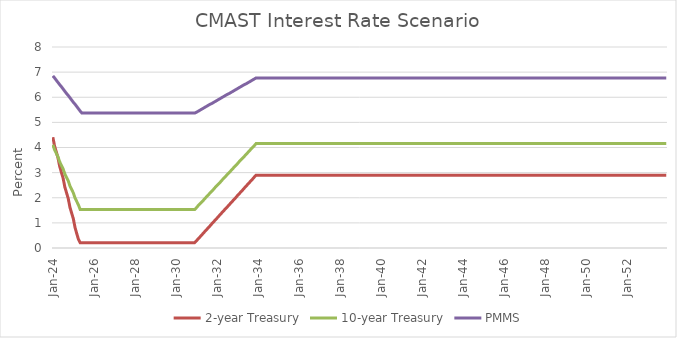
| Category | 2-year Treasury | 10-year Treasury | PMMS |
|---|---|---|---|
| 2024-01-31 | 4.41 | 4.11 | 6.85 |
| 2024-02-29 | 4.06 | 3.91 | 6.77 |
| 2024-03-29 | 3.83 | 3.77 | 6.68 |
| 2024-04-29 | 3.59 | 3.63 | 6.59 |
| 2024-05-29 | 3.25 | 3.43 | 6.5 |
| 2024-06-29 | 3.01 | 3.29 | 6.42 |
| 2024-07-29 | 2.78 | 3.15 | 6.33 |
| 2024-08-29 | 2.43 | 2.95 | 6.24 |
| 2024-09-29 | 2.2 | 2.81 | 6.15 |
| 2024-10-29 | 1.97 | 2.67 | 6.07 |
| 2024-11-29 | 1.62 | 2.47 | 5.98 |
| 2024-12-29 | 1.39 | 2.33 | 5.89 |
| 2025-01-29 | 1.16 | 2.19 | 5.8 |
| 2025-02-28 | 0.81 | 1.99 | 5.72 |
| 2025-03-28 | 0.57 | 1.85 | 5.63 |
| 2025-04-28 | 0.34 | 1.71 | 5.54 |
| 2025-05-28 | 0.21 | 1.53 | 5.45 |
| 2025-06-28 | 0.21 | 1.53 | 5.37 |
| 2025-07-28 | 0.21 | 1.53 | 5.37 |
| 2025-08-28 | 0.21 | 1.53 | 5.37 |
| 2025-09-28 | 0.21 | 1.53 | 5.37 |
| 2025-10-28 | 0.21 | 1.53 | 5.37 |
| 2025-11-28 | 0.21 | 1.53 | 5.37 |
| 2025-12-28 | 0.21 | 1.53 | 5.37 |
| 2026-01-28 | 0.21 | 1.53 | 5.37 |
| 2026-02-28 | 0.21 | 1.53 | 5.37 |
| 2026-03-28 | 0.21 | 1.53 | 5.37 |
| 2026-04-28 | 0.21 | 1.53 | 5.37 |
| 2026-05-28 | 0.21 | 1.53 | 5.37 |
| 2026-06-28 | 0.21 | 1.53 | 5.37 |
| 2026-07-28 | 0.21 | 1.53 | 5.37 |
| 2026-08-28 | 0.21 | 1.53 | 5.37 |
| 2026-09-28 | 0.21 | 1.53 | 5.37 |
| 2026-10-28 | 0.21 | 1.53 | 5.37 |
| 2026-11-28 | 0.21 | 1.53 | 5.37 |
| 2026-12-28 | 0.21 | 1.53 | 5.37 |
| 2027-01-28 | 0.21 | 1.53 | 5.37 |
| 2027-02-28 | 0.21 | 1.53 | 5.37 |
| 2027-03-28 | 0.21 | 1.53 | 5.37 |
| 2027-04-28 | 0.21 | 1.53 | 5.37 |
| 2027-05-28 | 0.21 | 1.53 | 5.37 |
| 2027-06-28 | 0.21 | 1.53 | 5.37 |
| 2027-07-28 | 0.21 | 1.53 | 5.37 |
| 2027-08-28 | 0.21 | 1.53 | 5.37 |
| 2027-09-28 | 0.21 | 1.53 | 5.37 |
| 2027-10-28 | 0.21 | 1.53 | 5.37 |
| 2027-11-28 | 0.21 | 1.53 | 5.37 |
| 2027-12-28 | 0.21 | 1.53 | 5.37 |
| 2028-01-28 | 0.21 | 1.53 | 5.37 |
| 2028-02-28 | 0.21 | 1.53 | 5.37 |
| 2028-03-28 | 0.21 | 1.53 | 5.37 |
| 2028-04-28 | 0.21 | 1.53 | 5.37 |
| 2028-05-28 | 0.21 | 1.53 | 5.37 |
| 2028-06-28 | 0.21 | 1.53 | 5.37 |
| 2028-07-28 | 0.21 | 1.53 | 5.37 |
| 2028-08-28 | 0.21 | 1.53 | 5.37 |
| 2028-09-28 | 0.21 | 1.53 | 5.37 |
| 2028-10-28 | 0.21 | 1.53 | 5.37 |
| 2028-11-28 | 0.21 | 1.53 | 5.37 |
| 2028-12-28 | 0.21 | 1.53 | 5.37 |
| 2029-01-28 | 0.21 | 1.53 | 5.37 |
| 2029-02-28 | 0.21 | 1.53 | 5.37 |
| 2029-03-28 | 0.21 | 1.53 | 5.37 |
| 2029-04-28 | 0.21 | 1.53 | 5.37 |
| 2029-05-28 | 0.21 | 1.53 | 5.37 |
| 2029-06-28 | 0.21 | 1.53 | 5.37 |
| 2029-07-28 | 0.21 | 1.53 | 5.37 |
| 2029-08-28 | 0.21 | 1.53 | 5.37 |
| 2029-09-28 | 0.21 | 1.53 | 5.37 |
| 2029-10-28 | 0.21 | 1.53 | 5.37 |
| 2029-11-28 | 0.21 | 1.53 | 5.37 |
| 2029-12-28 | 0.21 | 1.53 | 5.37 |
| 2030-01-28 | 0.21 | 1.53 | 5.37 |
| 2030-02-28 | 0.21 | 1.53 | 5.37 |
| 2030-03-28 | 0.21 | 1.53 | 5.37 |
| 2030-04-28 | 0.21 | 1.53 | 5.37 |
| 2030-05-28 | 0.21 | 1.53 | 5.37 |
| 2030-06-28 | 0.21 | 1.53 | 5.37 |
| 2030-07-28 | 0.21 | 1.53 | 5.37 |
| 2030-08-28 | 0.21 | 1.53 | 5.37 |
| 2030-09-28 | 0.21 | 1.53 | 5.37 |
| 2030-10-28 | 0.21 | 1.53 | 5.37 |
| 2030-11-28 | 0.21 | 1.53 | 5.37 |
| 2030-12-28 | 0.21 | 1.53 | 5.37 |
| 2031-01-28 | 0.28 | 1.6 | 5.4 |
| 2031-02-28 | 0.36 | 1.68 | 5.44 |
| 2031-03-28 | 0.43 | 1.75 | 5.48 |
| 2031-04-28 | 0.51 | 1.82 | 5.52 |
| 2031-05-28 | 0.58 | 1.89 | 5.56 |
| 2031-06-28 | 0.66 | 1.97 | 5.6 |
| 2031-07-28 | 0.73 | 2.04 | 5.64 |
| 2031-08-28 | 0.81 | 2.11 | 5.68 |
| 2031-09-28 | 0.88 | 2.19 | 5.72 |
| 2031-10-28 | 0.96 | 2.26 | 5.75 |
| 2031-11-28 | 1.03 | 2.33 | 5.79 |
| 2031-12-28 | 1.11 | 2.41 | 5.83 |
| 2032-01-28 | 1.18 | 2.48 | 5.87 |
| 2032-02-28 | 1.26 | 2.55 | 5.91 |
| 2032-03-28 | 1.33 | 2.62 | 5.95 |
| 2032-04-28 | 1.41 | 2.7 | 5.99 |
| 2032-05-28 | 1.48 | 2.77 | 6.03 |
| 2032-06-28 | 1.56 | 2.84 | 6.07 |
| 2032-07-28 | 1.63 | 2.92 | 6.11 |
| 2032-08-28 | 1.7 | 2.99 | 6.14 |
| 2032-09-28 | 1.78 | 3.06 | 6.18 |
| 2032-10-28 | 1.85 | 3.13 | 6.22 |
| 2032-11-28 | 1.93 | 3.21 | 6.26 |
| 2032-12-28 | 2 | 3.28 | 6.3 |
| 2033-01-28 | 2.08 | 3.35 | 6.34 |
| 2033-02-28 | 2.15 | 3.43 | 6.38 |
| 2033-03-28 | 2.23 | 3.5 | 6.42 |
| 2033-04-28 | 2.3 | 3.57 | 6.46 |
| 2033-05-28 | 2.38 | 3.64 | 6.5 |
| 2033-06-28 | 2.45 | 3.72 | 6.53 |
| 2033-07-28 | 2.53 | 3.79 | 6.57 |
| 2033-08-28 | 2.6 | 3.86 | 6.61 |
| 2033-09-28 | 2.68 | 3.94 | 6.65 |
| 2033-10-28 | 2.75 | 4.01 | 6.69 |
| 2033-11-28 | 2.83 | 4.08 | 6.73 |
| 2033-12-28 | 2.9 | 4.16 | 6.77 |
| 2034-01-28 | 2.9 | 4.16 | 6.77 |
| 2034-02-28 | 2.9 | 4.16 | 6.77 |
| 2034-03-28 | 2.9 | 4.16 | 6.77 |
| 2034-04-28 | 2.9 | 4.16 | 6.77 |
| 2034-05-28 | 2.9 | 4.16 | 6.77 |
| 2034-06-28 | 2.9 | 4.16 | 6.77 |
| 2034-07-28 | 2.9 | 4.16 | 6.77 |
| 2034-08-28 | 2.9 | 4.16 | 6.77 |
| 2034-09-28 | 2.9 | 4.16 | 6.77 |
| 2034-10-28 | 2.9 | 4.16 | 6.77 |
| 2034-11-28 | 2.9 | 4.16 | 6.77 |
| 2034-12-28 | 2.9 | 4.16 | 6.77 |
| 2035-01-28 | 2.9 | 4.16 | 6.77 |
| 2035-02-28 | 2.9 | 4.16 | 6.77 |
| 2035-03-28 | 2.9 | 4.16 | 6.77 |
| 2035-04-28 | 2.9 | 4.16 | 6.77 |
| 2035-05-28 | 2.9 | 4.16 | 6.77 |
| 2035-06-28 | 2.9 | 4.16 | 6.77 |
| 2035-07-28 | 2.9 | 4.16 | 6.77 |
| 2035-08-28 | 2.9 | 4.16 | 6.77 |
| 2035-09-28 | 2.9 | 4.16 | 6.77 |
| 2035-10-28 | 2.9 | 4.16 | 6.77 |
| 2035-11-28 | 2.9 | 4.16 | 6.77 |
| 2035-12-28 | 2.9 | 4.16 | 6.77 |
| 2036-01-28 | 2.9 | 4.16 | 6.77 |
| 2036-02-28 | 2.9 | 4.16 | 6.77 |
| 2036-03-28 | 2.9 | 4.16 | 6.77 |
| 2036-04-28 | 2.9 | 4.16 | 6.77 |
| 2036-05-28 | 2.9 | 4.16 | 6.77 |
| 2036-06-28 | 2.9 | 4.16 | 6.77 |
| 2036-07-28 | 2.9 | 4.16 | 6.77 |
| 2036-08-28 | 2.9 | 4.16 | 6.77 |
| 2036-09-28 | 2.9 | 4.16 | 6.77 |
| 2036-10-28 | 2.9 | 4.16 | 6.77 |
| 2036-11-28 | 2.9 | 4.16 | 6.77 |
| 2036-12-28 | 2.9 | 4.16 | 6.77 |
| 2037-01-28 | 2.9 | 4.16 | 6.77 |
| 2037-02-28 | 2.9 | 4.16 | 6.77 |
| 2037-03-28 | 2.9 | 4.16 | 6.77 |
| 2037-04-28 | 2.9 | 4.16 | 6.77 |
| 2037-05-28 | 2.9 | 4.16 | 6.77 |
| 2037-06-28 | 2.9 | 4.16 | 6.77 |
| 2037-07-28 | 2.9 | 4.16 | 6.77 |
| 2037-08-28 | 2.9 | 4.16 | 6.77 |
| 2037-09-28 | 2.9 | 4.16 | 6.77 |
| 2037-10-28 | 2.9 | 4.16 | 6.77 |
| 2037-11-28 | 2.9 | 4.16 | 6.77 |
| 2037-12-28 | 2.9 | 4.16 | 6.77 |
| 2038-01-28 | 2.9 | 4.16 | 6.77 |
| 2038-02-28 | 2.9 | 4.16 | 6.77 |
| 2038-03-28 | 2.9 | 4.16 | 6.77 |
| 2038-04-28 | 2.9 | 4.16 | 6.77 |
| 2038-05-28 | 2.9 | 4.16 | 6.77 |
| 2038-06-28 | 2.9 | 4.16 | 6.77 |
| 2038-07-28 | 2.9 | 4.16 | 6.77 |
| 2038-08-28 | 2.9 | 4.16 | 6.77 |
| 2038-09-28 | 2.9 | 4.16 | 6.77 |
| 2038-10-28 | 2.9 | 4.16 | 6.77 |
| 2038-11-28 | 2.9 | 4.16 | 6.77 |
| 2038-12-28 | 2.9 | 4.16 | 6.77 |
| 2039-01-28 | 2.9 | 4.16 | 6.77 |
| 2039-02-28 | 2.9 | 4.16 | 6.77 |
| 2039-03-28 | 2.9 | 4.16 | 6.77 |
| 2039-04-28 | 2.9 | 4.16 | 6.77 |
| 2039-05-28 | 2.9 | 4.16 | 6.77 |
| 2039-06-28 | 2.9 | 4.16 | 6.77 |
| 2039-07-28 | 2.9 | 4.16 | 6.77 |
| 2039-08-28 | 2.9 | 4.16 | 6.77 |
| 2039-09-28 | 2.9 | 4.16 | 6.77 |
| 2039-10-28 | 2.9 | 4.16 | 6.77 |
| 2039-11-28 | 2.9 | 4.16 | 6.77 |
| 2039-12-28 | 2.9 | 4.16 | 6.77 |
| 2040-01-28 | 2.9 | 4.16 | 6.77 |
| 2040-02-28 | 2.9 | 4.16 | 6.77 |
| 2040-03-28 | 2.9 | 4.16 | 6.77 |
| 2040-04-28 | 2.9 | 4.16 | 6.77 |
| 2040-05-28 | 2.9 | 4.16 | 6.77 |
| 2040-06-28 | 2.9 | 4.16 | 6.77 |
| 2040-07-28 | 2.9 | 4.16 | 6.77 |
| 2040-08-28 | 2.9 | 4.16 | 6.77 |
| 2040-09-28 | 2.9 | 4.16 | 6.77 |
| 2040-10-28 | 2.9 | 4.16 | 6.77 |
| 2040-11-28 | 2.9 | 4.16 | 6.77 |
| 2040-12-28 | 2.9 | 4.16 | 6.77 |
| 2041-01-28 | 2.9 | 4.16 | 6.77 |
| 2041-02-28 | 2.9 | 4.16 | 6.77 |
| 2041-03-28 | 2.9 | 4.16 | 6.77 |
| 2041-04-28 | 2.9 | 4.16 | 6.77 |
| 2041-05-28 | 2.9 | 4.16 | 6.77 |
| 2041-06-28 | 2.9 | 4.16 | 6.77 |
| 2041-07-28 | 2.9 | 4.16 | 6.77 |
| 2041-08-28 | 2.9 | 4.16 | 6.77 |
| 2041-09-28 | 2.9 | 4.16 | 6.77 |
| 2041-10-28 | 2.9 | 4.16 | 6.77 |
| 2041-11-28 | 2.9 | 4.16 | 6.77 |
| 2041-12-28 | 2.9 | 4.16 | 6.77 |
| 2042-01-28 | 2.9 | 4.16 | 6.77 |
| 2042-02-28 | 2.9 | 4.16 | 6.77 |
| 2042-03-28 | 2.9 | 4.16 | 6.77 |
| 2042-04-28 | 2.9 | 4.16 | 6.77 |
| 2042-05-28 | 2.9 | 4.16 | 6.77 |
| 2042-06-28 | 2.9 | 4.16 | 6.77 |
| 2042-07-28 | 2.9 | 4.16 | 6.77 |
| 2042-08-28 | 2.9 | 4.16 | 6.77 |
| 2042-09-28 | 2.9 | 4.16 | 6.77 |
| 2042-10-28 | 2.9 | 4.16 | 6.77 |
| 2042-11-28 | 2.9 | 4.16 | 6.77 |
| 2042-12-28 | 2.9 | 4.16 | 6.77 |
| 2043-01-28 | 2.9 | 4.16 | 6.77 |
| 2043-02-28 | 2.9 | 4.16 | 6.77 |
| 2043-03-28 | 2.9 | 4.16 | 6.77 |
| 2043-04-28 | 2.9 | 4.16 | 6.77 |
| 2043-05-28 | 2.9 | 4.16 | 6.77 |
| 2043-06-28 | 2.9 | 4.16 | 6.77 |
| 2043-07-28 | 2.9 | 4.16 | 6.77 |
| 2043-08-28 | 2.9 | 4.16 | 6.77 |
| 2043-09-28 | 2.9 | 4.16 | 6.77 |
| 2043-10-28 | 2.9 | 4.16 | 6.77 |
| 2043-11-28 | 2.9 | 4.16 | 6.77 |
| 2043-12-28 | 2.9 | 4.16 | 6.77 |
| 2044-01-28 | 2.9 | 4.16 | 6.77 |
| 2044-02-28 | 2.9 | 4.16 | 6.77 |
| 2044-03-28 | 2.9 | 4.16 | 6.77 |
| 2044-04-28 | 2.9 | 4.16 | 6.77 |
| 2044-05-28 | 2.9 | 4.16 | 6.77 |
| 2044-06-28 | 2.9 | 4.16 | 6.77 |
| 2044-07-28 | 2.9 | 4.16 | 6.77 |
| 2044-08-28 | 2.9 | 4.16 | 6.77 |
| 2044-09-28 | 2.9 | 4.16 | 6.77 |
| 2044-10-28 | 2.9 | 4.16 | 6.77 |
| 2044-11-28 | 2.9 | 4.16 | 6.77 |
| 2044-12-28 | 2.9 | 4.16 | 6.77 |
| 2045-01-28 | 2.9 | 4.16 | 6.77 |
| 2045-02-28 | 2.9 | 4.16 | 6.77 |
| 2045-03-28 | 2.9 | 4.16 | 6.77 |
| 2045-04-28 | 2.9 | 4.16 | 6.77 |
| 2045-05-28 | 2.9 | 4.16 | 6.77 |
| 2045-06-28 | 2.9 | 4.16 | 6.77 |
| 2045-07-28 | 2.9 | 4.16 | 6.77 |
| 2045-08-28 | 2.9 | 4.16 | 6.77 |
| 2045-09-28 | 2.9 | 4.16 | 6.77 |
| 2045-10-28 | 2.9 | 4.16 | 6.77 |
| 2045-11-28 | 2.9 | 4.16 | 6.77 |
| 2045-12-28 | 2.9 | 4.16 | 6.77 |
| 2046-01-28 | 2.9 | 4.16 | 6.77 |
| 2046-02-28 | 2.9 | 4.16 | 6.77 |
| 2046-03-28 | 2.9 | 4.16 | 6.77 |
| 2046-04-28 | 2.9 | 4.16 | 6.77 |
| 2046-05-28 | 2.9 | 4.16 | 6.77 |
| 2046-06-28 | 2.9 | 4.16 | 6.77 |
| 2046-07-28 | 2.9 | 4.16 | 6.77 |
| 2046-08-28 | 2.9 | 4.16 | 6.77 |
| 2046-09-28 | 2.9 | 4.16 | 6.77 |
| 2046-10-28 | 2.9 | 4.16 | 6.77 |
| 2046-11-28 | 2.9 | 4.16 | 6.77 |
| 2046-12-28 | 2.9 | 4.16 | 6.77 |
| 2047-01-28 | 2.9 | 4.16 | 6.77 |
| 2047-02-28 | 2.9 | 4.16 | 6.77 |
| 2047-03-28 | 2.9 | 4.16 | 6.77 |
| 2047-04-28 | 2.9 | 4.16 | 6.77 |
| 2047-05-28 | 2.9 | 4.16 | 6.77 |
| 2047-06-28 | 2.9 | 4.16 | 6.77 |
| 2047-07-28 | 2.9 | 4.16 | 6.77 |
| 2047-08-28 | 2.9 | 4.16 | 6.77 |
| 2047-09-28 | 2.9 | 4.16 | 6.77 |
| 2047-10-28 | 2.9 | 4.16 | 6.77 |
| 2047-11-28 | 2.9 | 4.16 | 6.77 |
| 2047-12-28 | 2.9 | 4.16 | 6.77 |
| 2048-01-28 | 2.9 | 4.16 | 6.77 |
| 2048-02-28 | 2.9 | 4.16 | 6.77 |
| 2048-03-28 | 2.9 | 4.16 | 6.77 |
| 2048-04-28 | 2.9 | 4.16 | 6.77 |
| 2048-05-28 | 2.9 | 4.16 | 6.77 |
| 2048-06-28 | 2.9 | 4.16 | 6.77 |
| 2048-07-28 | 2.9 | 4.16 | 6.77 |
| 2048-08-28 | 2.9 | 4.16 | 6.77 |
| 2048-09-28 | 2.9 | 4.16 | 6.77 |
| 2048-10-28 | 2.9 | 4.16 | 6.77 |
| 2048-11-28 | 2.9 | 4.16 | 6.77 |
| 2048-12-28 | 2.9 | 4.16 | 6.77 |
| 2049-01-28 | 2.9 | 4.16 | 6.77 |
| 2049-02-28 | 2.9 | 4.16 | 6.77 |
| 2049-03-28 | 2.9 | 4.16 | 6.77 |
| 2049-04-28 | 2.9 | 4.16 | 6.77 |
| 2049-05-28 | 2.9 | 4.16 | 6.77 |
| 2049-06-28 | 2.9 | 4.16 | 6.77 |
| 2049-07-28 | 2.9 | 4.16 | 6.77 |
| 2049-08-28 | 2.9 | 4.16 | 6.77 |
| 2049-09-28 | 2.9 | 4.16 | 6.77 |
| 2049-10-28 | 2.9 | 4.16 | 6.77 |
| 2049-11-28 | 2.9 | 4.16 | 6.77 |
| 2049-12-28 | 2.9 | 4.16 | 6.77 |
| 2050-01-28 | 2.9 | 4.16 | 6.77 |
| 2050-02-28 | 2.9 | 4.16 | 6.77 |
| 2050-03-28 | 2.9 | 4.16 | 6.77 |
| 2050-04-28 | 2.9 | 4.16 | 6.77 |
| 2050-05-28 | 2.9 | 4.16 | 6.77 |
| 2050-06-28 | 2.9 | 4.16 | 6.77 |
| 2050-07-28 | 2.9 | 4.16 | 6.77 |
| 2050-08-28 | 2.9 | 4.16 | 6.77 |
| 2050-09-28 | 2.9 | 4.16 | 6.77 |
| 2050-10-28 | 2.9 | 4.16 | 6.77 |
| 2050-11-28 | 2.9 | 4.16 | 6.77 |
| 2050-12-28 | 2.9 | 4.16 | 6.77 |
| 2051-01-28 | 2.9 | 4.16 | 6.77 |
| 2051-02-28 | 2.9 | 4.16 | 6.77 |
| 2051-03-28 | 2.9 | 4.16 | 6.77 |
| 2051-04-28 | 2.9 | 4.16 | 6.77 |
| 2051-05-28 | 2.9 | 4.16 | 6.77 |
| 2051-06-28 | 2.9 | 4.16 | 6.77 |
| 2051-07-28 | 2.9 | 4.16 | 6.77 |
| 2051-08-28 | 2.9 | 4.16 | 6.77 |
| 2051-09-28 | 2.9 | 4.16 | 6.77 |
| 2051-10-28 | 2.9 | 4.16 | 6.77 |
| 2051-11-28 | 2.9 | 4.16 | 6.77 |
| 2051-12-28 | 2.9 | 4.16 | 6.77 |
| 2052-01-28 | 2.9 | 4.16 | 6.77 |
| 2052-02-28 | 2.9 | 4.16 | 6.77 |
| 2052-03-28 | 2.9 | 4.16 | 6.77 |
| 2052-04-28 | 2.9 | 4.16 | 6.77 |
| 2052-05-28 | 2.9 | 4.16 | 6.77 |
| 2052-06-28 | 2.9 | 4.16 | 6.77 |
| 2052-07-28 | 2.9 | 4.16 | 6.77 |
| 2052-08-28 | 2.9 | 4.16 | 6.77 |
| 2052-09-28 | 2.9 | 4.16 | 6.77 |
| 2052-10-28 | 2.9 | 4.16 | 6.77 |
| 2052-11-28 | 2.9 | 4.16 | 6.77 |
| 2052-12-28 | 2.9 | 4.16 | 6.77 |
| 2053-01-28 | 2.9 | 4.16 | 6.77 |
| 2053-02-28 | 2.9 | 4.16 | 6.77 |
| 2053-03-28 | 2.9 | 4.16 | 6.77 |
| 2053-04-28 | 2.9 | 4.16 | 6.77 |
| 2053-05-28 | 2.9 | 4.16 | 6.77 |
| 2053-06-28 | 2.9 | 4.16 | 6.77 |
| 2053-07-28 | 2.9 | 4.16 | 6.77 |
| 2053-08-28 | 2.9 | 4.16 | 6.77 |
| 2053-09-28 | 2.9 | 4.16 | 6.77 |
| 2053-10-28 | 2.9 | 4.16 | 6.77 |
| 2053-11-28 | 2.9 | 4.16 | 6.77 |
| 2053-12-28 | 2.9 | 4.16 | 6.77 |